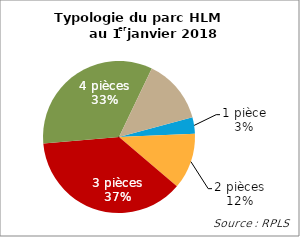
| Category | Series 0 |
|---|---|
| 1 pièce | 0.035 |
| 2 pièces | 0.119 |
| 3 pièces | 0.374 |
| 4 pièces | 0.335 |
| 5 pièces+ | 0.137 |